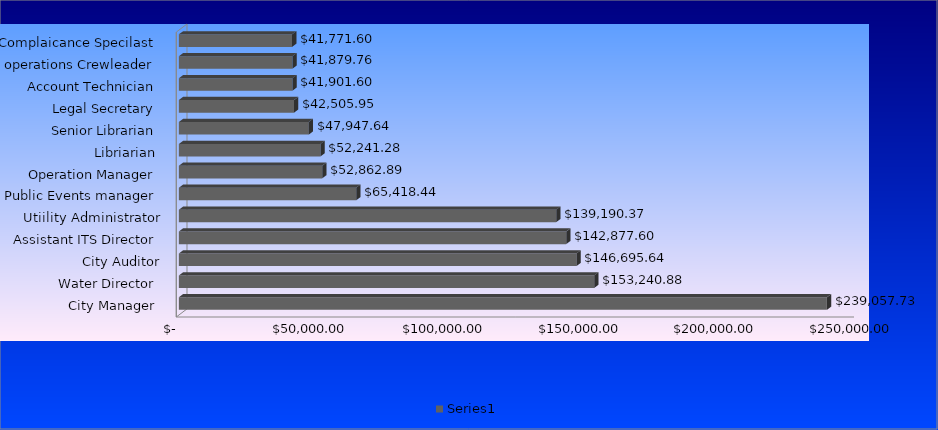
| Category | Series 0 |
|---|---|
| City Manager  | 239057.725 |
| Water Director  | 153240.88 |
| City Auditor | 146695.64 |
| Assistant ITS Director  | 142877.595 |
| Utiility Administrator | 139190.37 |
| Public Events manager  | 65418.44 |
| Operation Manager  | 52862.885 |
| Libriarian  | 52241.28 |
| Senior Librarian  | 47947.64 |
| Legal Secretary  | 42505.95 |
| Account Technician  | 41901.6 |
| Field operations Crewleader  | 41879.76 |
| Complaicance Specilast  | 41771.6 |